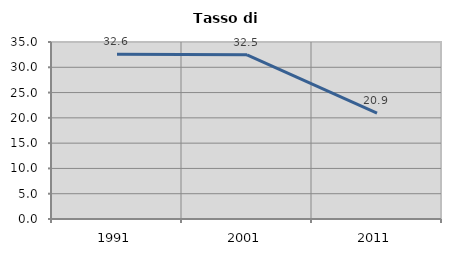
| Category | Tasso di disoccupazione   |
|---|---|
| 1991.0 | 32.584 |
| 2001.0 | 32.468 |
| 2011.0 | 20.93 |